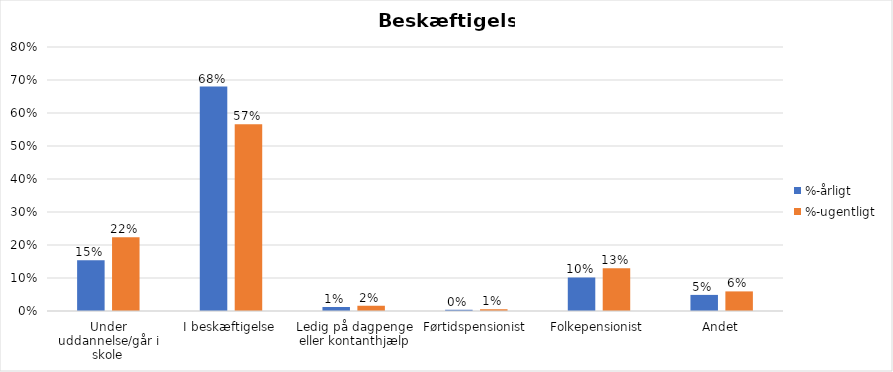
| Category | %-årligt | %-ugentligt |
|---|---|---|
| Under uddannelse/går i skole | 0.153 | 0.224 |
| I beskæftigelse | 0.68 | 0.566 |
| Ledig på dagpenge eller kontanthjælp | 0.012 | 0.016 |
| Førtidspensionist | 0.004 | 0.005 |
| Folkepensionist | 0.102 | 0.129 |
| Andet | 0.049 | 0.059 |